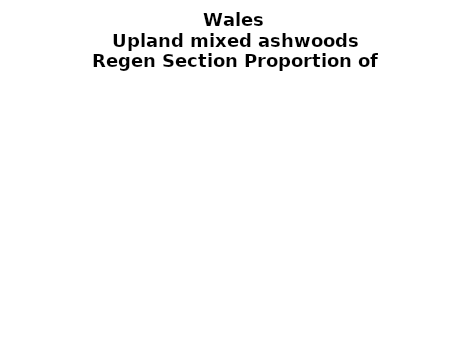
| Category | Upland mixed ashwoods |
|---|---|
| None | 0.129 |
| Seedlings only | 0 |
| Seedlings, saplings only | 0.006 |
| Seedlings, saplings, <7 cm trees | 0.118 |
| Saplings only | 0.158 |
| <7 cm trees, seedlings only | 0 |
| <7 cm trees, saplings only | 0.568 |
| <7 cm Trees only | 0.021 |